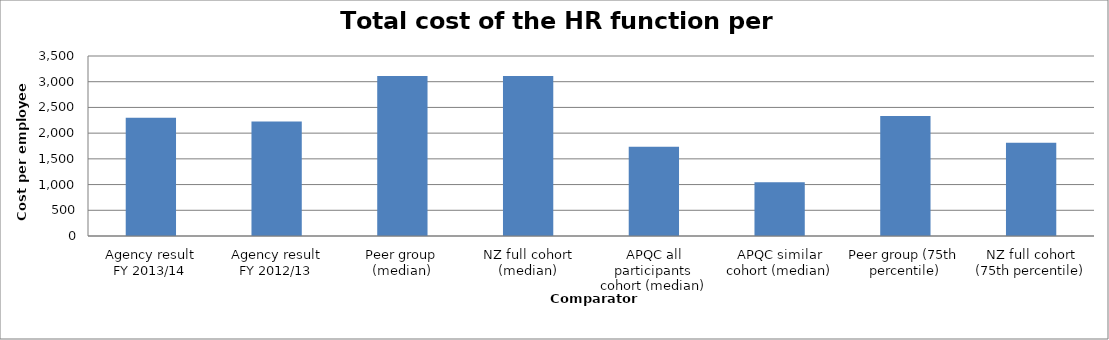
| Category | Result |
|---|---|
| Agency result
FY 2013/14 | 2298.214 |
| Agency result
FY 2012/13 | 2225.962 |
| Peer group (median) | 3110.149 |
| NZ full cohort (median) | 3110.149 |
| APQC all participants cohort (median) | 1734.58 |
| APQC similar cohort (median) | 1045 |
| Peer group (75th percentile) | 2334.663 |
| NZ full cohort (75th percentile) | 1813.424 |